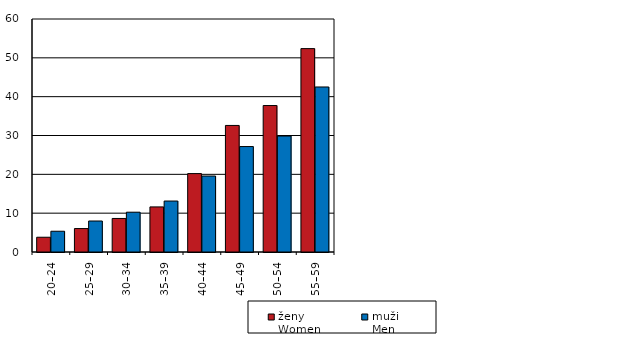
| Category | ženy  
Women | muži  
Men |
|---|---|---|
| 20–24 | 3802 | 5346 |
| 25–29 | 6038 | 7982 |
| 30–34 | 8638 | 10250 |
| 35–39 | 11612 | 13124 |
| 40–44 | 20189 | 19566 |
| 45–49 | 32591 | 27154 |
| 50–54 | 37717 | 29867 |
| 55–59 | 52374 | 42494 |